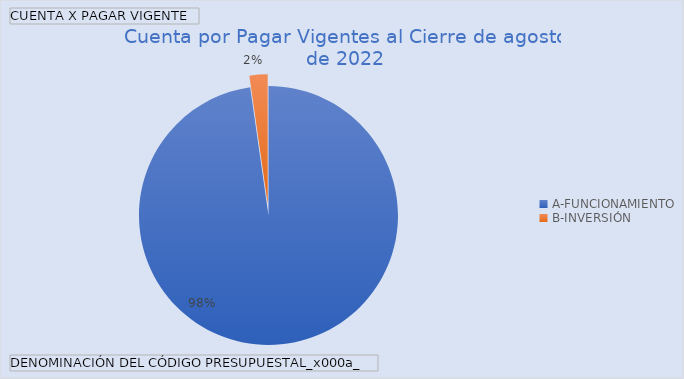
| Category | Total |
|---|---|
| A-FUNCIONAMIENTO | 7893.785 |
| B-INVERSIÓN | 182.429 |